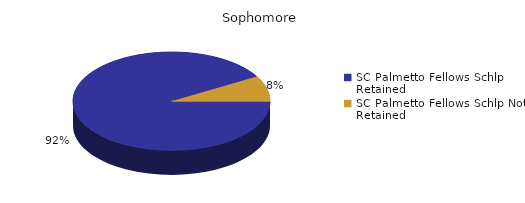
| Category | Sophomore |
|---|---|
| SC Palmetto Fellows Schlp Retained  | 550 |
| SC Palmetto Fellows Schlp Not Retained  | 50 |